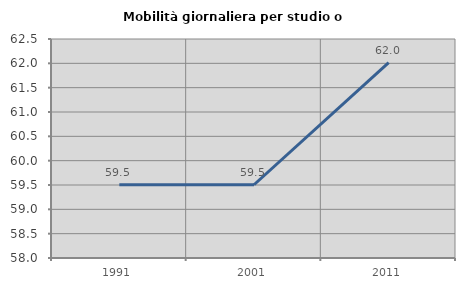
| Category | Mobilità giornaliera per studio o lavoro |
|---|---|
| 1991.0 | 59.508 |
| 2001.0 | 59.505 |
| 2011.0 | 62.015 |